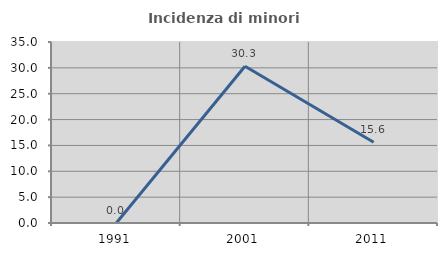
| Category | Incidenza di minori stranieri |
|---|---|
| 1991.0 | 0 |
| 2001.0 | 30.303 |
| 2011.0 | 15.625 |